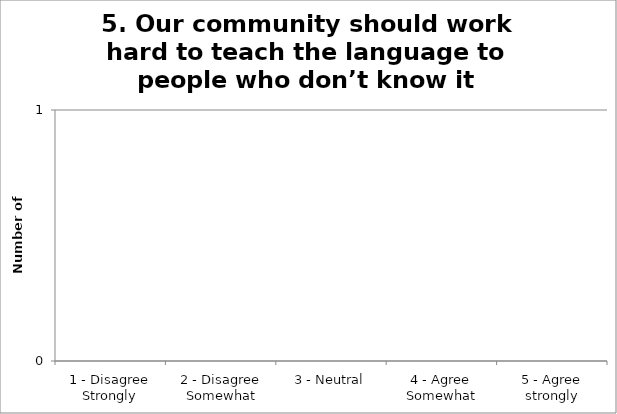
| Category | 5. Our community should work hard to teach the language to people who don’t know it |
|---|---|
| 1 - Disagree Strongly | 0 |
| 2 - Disagree Somewhat | 0 |
| 3 - Neutral | 0 |
| 4 - Agree Somewhat | 0 |
| 5 - Agree strongly | 0 |